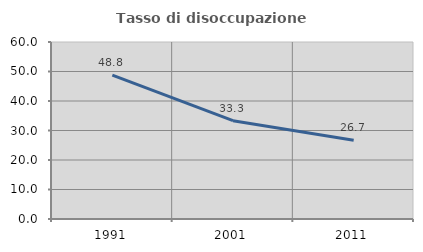
| Category | Tasso di disoccupazione giovanile  |
|---|---|
| 1991.0 | 48.78 |
| 2001.0 | 33.333 |
| 2011.0 | 26.667 |